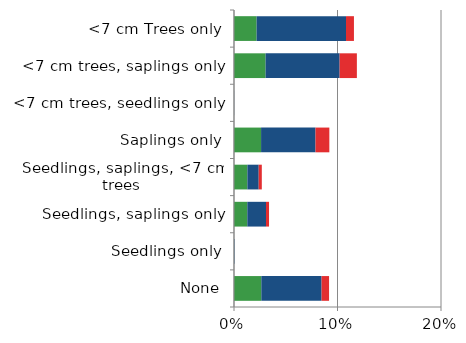
| Category | England | Scotland | Wales |
|---|---|---|---|
| None | 0.026 | 0.058 | 0.007 |
| Seedlings only | 0 | 0 | 0 |
| Seedlings, saplings only | 0.013 | 0.018 | 0.003 |
| Seedlings, saplings, <7 cm trees | 0.013 | 0.011 | 0.003 |
| Saplings only | 0.026 | 0.053 | 0.013 |
| <7 cm trees, seedlings only | 0 | 0 | 0 |
| <7 cm trees, saplings only | 0.031 | 0.072 | 0.017 |
| <7 cm Trees only | 0.022 | 0.086 | 0.008 |